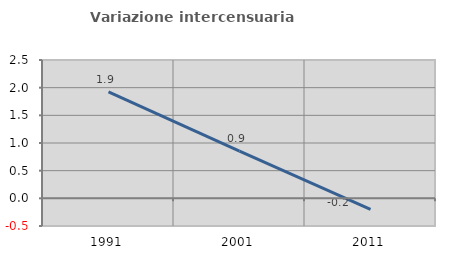
| Category | Variazione intercensuaria annua |
|---|---|
| 1991.0 | 1.923 |
| 2001.0 | 0.852 |
| 2011.0 | -0.2 |